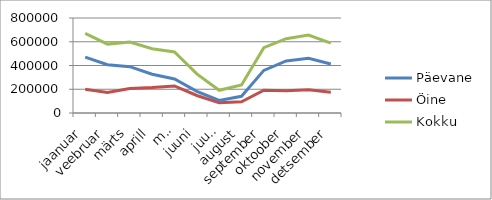
| Category | Päevane | Öine | Kokku |
|---|---|---|---|
| jaanuar | 471151.7 | 199191.4 | 670343.1 |
| veebruar | 406993.5 | 173093.7 | 580087.2 |
| märts | 390189.3 | 207030.1 | 597219.4 |
| aprill | 326828.5 | 213728.1 | 540556.6 |
| mai | 286062.6 | 227428.8 | 513491.4 |
| juuni | 181792.9 | 147463.8 | 329256.7 |
| juuli | 105231.4 | 85779.6 | 191011 |
| august | 140861 | 95068.4 | 235929.4 |
| september | 358823.2 | 191320.4 | 550143.6 |
| oktoober | 438581.4 | 187471.1 | 626052.5 |
| november | 460907.7 | 195843.6 | 656751.3 |
| detsember | 412694.6 | 175715.3 | 588409.9 |